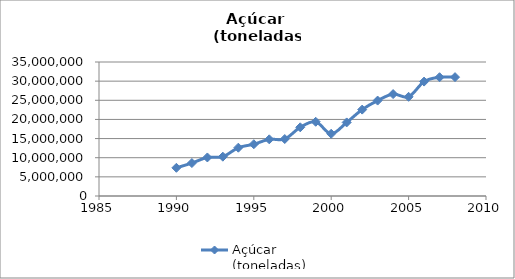
| Category | Açúcar 
(toneladas) |
|---|---|
| 1990.0 | 7365344.45 |
| 1991.0 | 8604321.2 |
| 1992.0 | 10066489.7 |
| 1993.0 | 10269996 |
| 1994.0 | 12618164.9 |
| 1995.0 | 13522128.75 |
| 1996.0 | 14802380 |
| 1997.0 | 14880691 |
| 1998.0 | 17942109 |
| 1999.0 | 19387515 |
| 2000.0 | 16256105 |
| 2001.0 | 19218011 |
| 2002.0 | 22567260 |
| 2003.0 | 24925793 |
| 2004.0 | 26621221 |
| 2005.0 | 25905723 |
| 2006.0 | 29882433 |
| 2007.0 | 31026170 |
| 2008.0 | 31049206.389 |